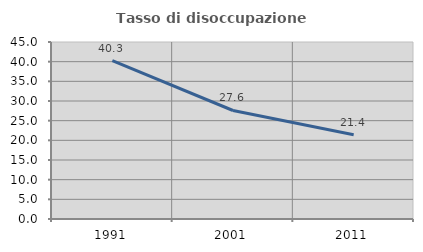
| Category | Tasso di disoccupazione giovanile  |
|---|---|
| 1991.0 | 40.278 |
| 2001.0 | 27.586 |
| 2011.0 | 21.429 |